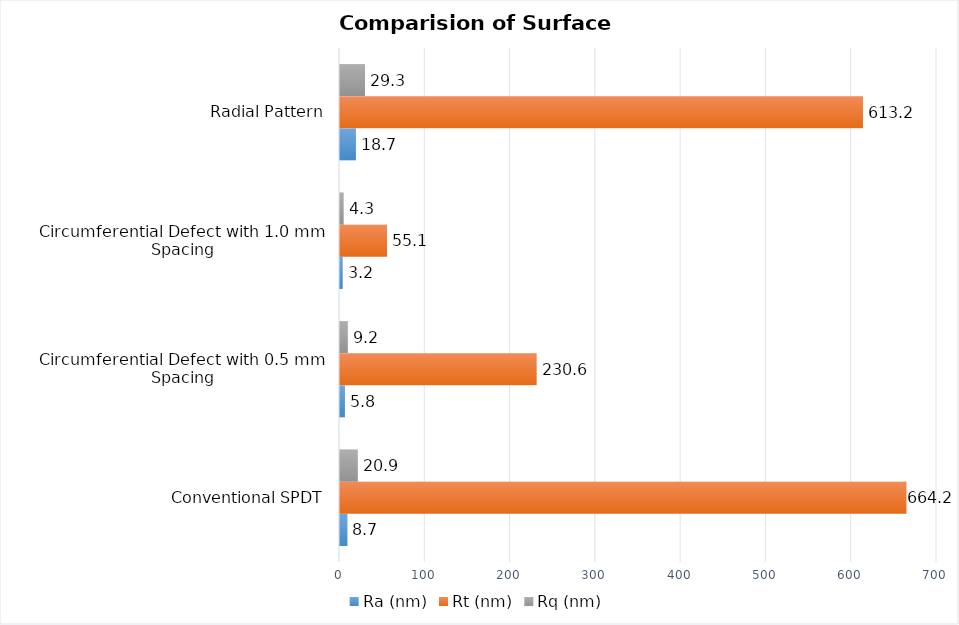
| Category | Ra (nm) | Rt (nm) | Rq (nm) |
|---|---|---|---|
| Conventional SPDT | 8.7 | 664.2 | 20.9 |
| Circumferential Defect with 0.5 mm Spacing | 5.8 | 230.6 | 9.2 |
| Circumferential Defect with 1.0 mm Spacing | 3.2 | 55.1 | 4.3 |
| Radial Pattern | 18.7 | 613.2 | 29.3 |